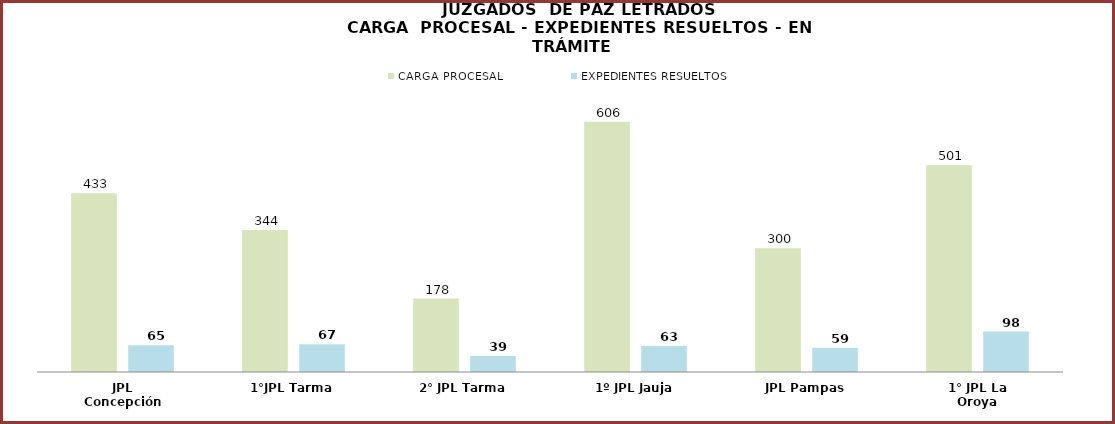
| Category | CARGA PROCESAL | EXPEDIENTES RESUELTOS |
|---|---|---|
| JPL Concepción | 433 | 65 |
| 1°JPL Tarma | 344 | 67 |
| 2° JPL Tarma | 178 | 39 |
| 1º JPL Jauja | 606 | 63 |
| JPL Pampas | 300 | 59 |
| 1° JPL La Oroya | 501 | 98 |